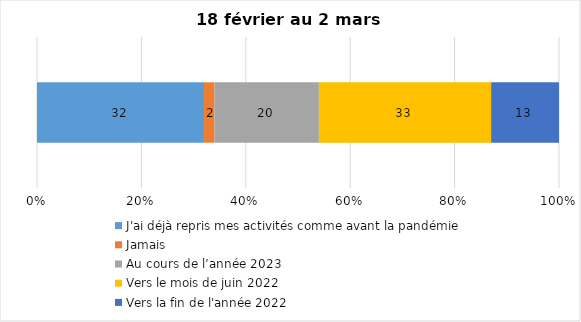
| Category | J'ai déjà repris mes activités comme avant la pandémie | Jamais | Au cours de l’année 2023 | Vers le mois de juin 2022 | Vers la fin de l'année 2022 |
|---|---|---|---|---|---|
| 0 | 32 | 2 | 20 | 33 | 13 |